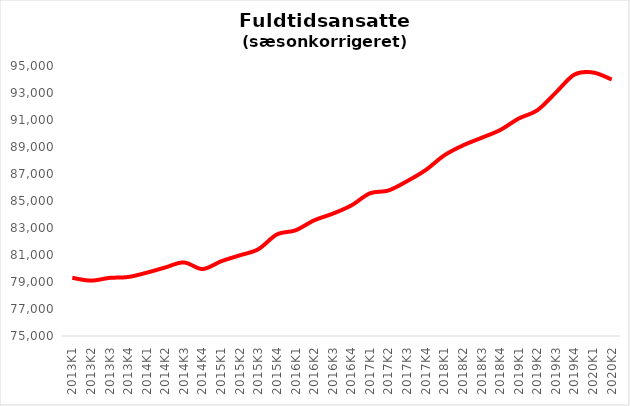
| Category | It-branchen i alt |
|---|---|
| 2013K1 | 79310.318 |
| 2013K2 | 79100.892 |
| 2013K3 | 79303.464 |
| 2013K4 | 79368.764 |
| 2014K1 | 79689.242 |
| 2014K2 | 80078.522 |
| 2014K3 | 80449.511 |
| 2014K4 | 79960.105 |
| 2015K1 | 80533.379 |
| 2015K2 | 80974.832 |
| 2015K3 | 81428.235 |
| 2015K4 | 82521.801 |
| 2016K1 | 82827.398 |
| 2016K2 | 83564.176 |
| 2016K3 | 84058.662 |
| 2016K4 | 84670.038 |
| 2017K1 | 85566.522 |
| 2017K2 | 85780.481 |
| 2017K3 | 86469.76 |
| 2017K4 | 87292.538 |
| 2018K1 | 88382.4 |
| 2018K2 | 89116.581 |
| 2018K3 | 89679.316 |
| 2018K4 | 90254.591 |
| 2019K1 | 91108.827 |
| 2019K2 | 91719.253 |
| 2019K3 | 93036.729 |
| 2019K4 | 94368.655 |
| 2020K1 | 94519.153 |
| 2020K2 | 94000.338 |